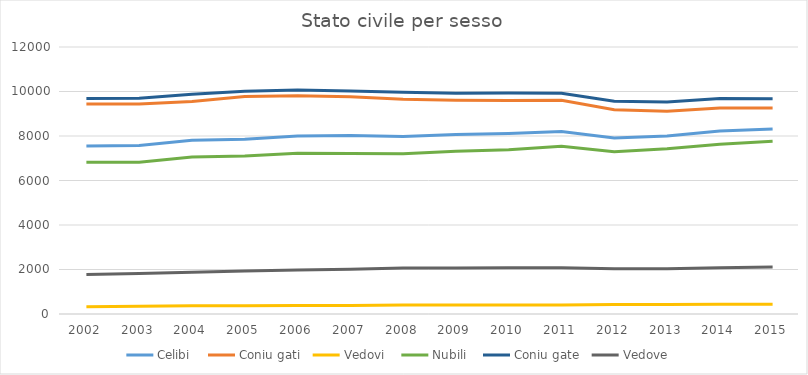
| Category | Celibi | Coniu | Vedovi | Nubili | Vedove |
|---|---|---|---|---|---|
| 2002.0 | 7555 | 9680 | 331 | 6820 | 1777 |
| 2003.0 | 7570 | 9692 | 343 | 6819 | 1818 |
| 2004.0 | 7813 | 9877 | 366 | 7051 | 1879 |
| 2005.0 | 7859 | 10010 | 376 | 7096 | 1931 |
| 2006.0 | 7999 | 10067 | 377 | 7221 | 1980 |
| 2007.0 | 8028 | 10019 | 386 | 7216 | 2009 |
| 2008.0 | 7983 | 9965 | 400 | 7201 | 2069 |
| 2009.0 | 8063 | 9920 | 405 | 7317 | 2072 |
| 2010.0 | 8112 | 9937 | 410 | 7378 | 2078 |
| 2011.0 | 8201 | 9917 | 405 | 7542 | 2081 |
| 2012.0 | 7911 | 9560 | 422 | 7296 | 2039 |
| 2013.0 | 8003 | 9527 | 426 | 7427 | 2039 |
| 2014.0 | 8225 | 9684 | 440 | 7626 | 2083 |
| 2015.0 | 8317 | 9670 | 433 | 7759 | 2108 |